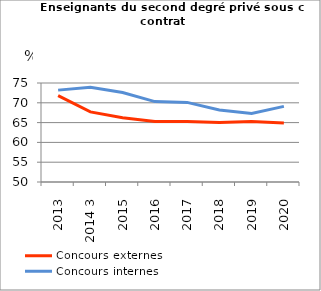
| Category | Concours externes  | Concours internes |
|---|---|---|
| 2013 | 71.8 | 73.2 |
| 2014 3 | 67.7 | 73.9 |
| 2015 | 66.2 | 72.6 |
| 2016 | 65.3 | 70.3 |
| 2017 | 65.3 | 70.1 |
| 2018 | 65 | 68.2 |
| 2019 | 65.3 | 67.3 |
| 2020 | 64.9 | 69.1 |